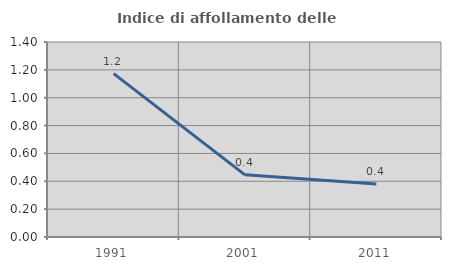
| Category | Indice di affollamento delle abitazioni  |
|---|---|
| 1991.0 | 1.173 |
| 2001.0 | 0.446 |
| 2011.0 | 0.381 |